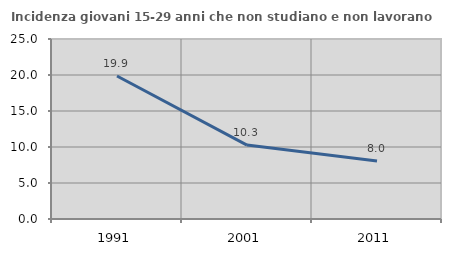
| Category | Incidenza giovani 15-29 anni che non studiano e non lavorano  |
|---|---|
| 1991.0 | 19.858 |
| 2001.0 | 10.265 |
| 2011.0 | 8.046 |